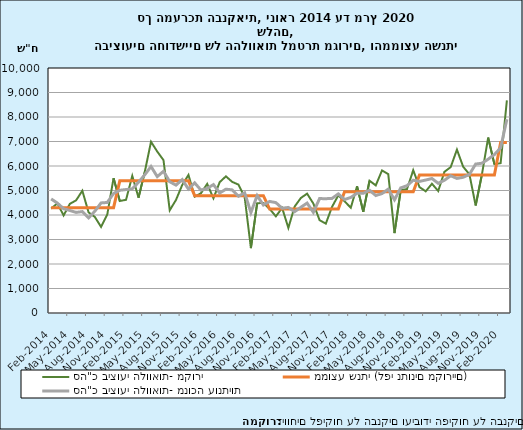
| Category | סה"כ ביצועי הלוואות- מקורי | ממוצע שנתי (לפי נתונים מקוריים) | סה"כ ביצועי הלוואות- מנוכה עונתיות |
|---|---|---|---|
| 2014-02-28 | 4262.255 | 4300.78 | 4656.6 |
| 2014-03-31 | 4474.033 | 4300.78 | 4486.302 |
| 2014-04-30 | 3982.901 | 4300.78 | 4256.606 |
| 2014-05-31 | 4455.752 | 4300.78 | 4184.699 |
| 2014-06-30 | 4597.51 | 4300.78 | 4105.33 |
| 2014-07-31 | 4990.735 | 4300.78 | 4140.172 |
| 2014-08-31 | 4107.263 | 4300.78 | 3880.733 |
| 2014-09-30 | 3921.35 | 4300.78 | 4154.599 |
| 2014-10-31 | 3514.015 | 4300.78 | 4493.338 |
| 2014-11-30 | 4028.095 | 4300.78 | 4511.738 |
| 2014-12-31 | 5503.691 | 4300.78 | 4878.427 |
| 2015-01-31 | 4571.678 | 5395.235 | 5009.474 |
| 2015-02-28 | 4620.799 | 5395.235 | 5038.755 |
| 2015-03-31 | 5598.333 | 5395.235 | 5068.132 |
| 2015-04-30 | 4706.018 | 5395.235 | 5336.437 |
| 2015-05-31 | 5758.492 | 5395.235 | 5642.826 |
| 2015-06-30 | 6989.609 | 5395.235 | 5979.787 |
| 2015-07-31 | 6589.807 | 5395.235 | 5567.734 |
| 2015-08-31 | 6239.136 | 5395.235 | 5784.56 |
| 2015-09-30 | 4193.816 | 5395.235 | 5357.218 |
| 2015-10-31 | 4614.968 | 5395.235 | 5219.326 |
| 2015-11-30 | 5225.496 | 5395.235 | 5444.914 |
| 2015-12-31 | 5634.671 | 5395.235 | 5056.326 |
| 2016-01-31 | 4749.288 | 4787.84 | 5310.136 |
| 2016-02-29 | 4887.666 | 4787.84 | 5015.614 |
| 2016-03-31 | 5270.148 | 4787.84 | 5085.74 |
| 2016-04-30 | 4682.424 | 4787.84 | 5241.66 |
| 2016-05-31 | 5341.393 | 4787.84 | 4898.916 |
| 2016-06-30 | 5578.193 | 4787.84 | 5053.7 |
| 2016-07-31 | 5352.595 | 4787.84 | 5025.18 |
| 2016-08-31 | 5241.707 | 4787.84 | 4765.946 |
| 2016-09-30 | 4731.688 | 4787.84 | 4905.809 |
| 2016-10-31 | 2647.758 | 4787.84 | 4099.974 |
| 2016-11-30 | 4481.202 | 4787.84 | 4791.876 |
| 2016-12-31 | 4490.01 | 4787.84 | 4408.024 |
| 2017-01-31 | 4248.31 | 4242.381 | 4553.314 |
| 2017-02-28 | 3944.469 | 4242.381 | 4505.337 |
| 2017-03-31 | 4289.487 | 4242.381 | 4275.485 |
| 2017-04-30 | 3473.905 | 4242.381 | 4309.382 |
| 2017-05-31 | 4342.823 | 4242.381 | 4133.867 |
| 2017-06-30 | 4694.724 | 4242.381 | 4314.875 |
| 2017-07-31 | 4871.464 | 4242.381 | 4487.427 |
| 2017-08-31 | 4468.632 | 4242.381 | 4109.391 |
| 2017-09-30 | 3788.691 | 4242.381 | 4670.494 |
| 2017-10-31 | 3648.135 | 4242.381 | 4665.296 |
| 2017-11-30 | 4335.356 | 4242.381 | 4677.791 |
| 2017-12-31 | 4802.58 | 4242.381 | 4861.406 |
| 2018-01-31 | 4559.431 | 4952.046 | 4632.492 |
| 2018-02-28 | 4295.92 | 4952.046 | 4715.88 |
| 2018-03-31 | 5172.816 | 4952.046 | 4890.041 |
| 2018-04-30 | 4132.657 | 4952.046 | 4885.777 |
| 2018-05-31 | 5400.146 | 4952.046 | 5012.274 |
| 2018-06-30 | 5210.652 | 4952.046 | 4795.296 |
| 2018-07-31 | 5820.56 | 4952.046 | 4874.554 |
| 2018-08-31 | 5667.401 | 4952.046 | 5055.894 |
| 2018-09-30 | 3261.965 | 4952.046 | 4620.998 |
| 2018-10-31 | 5018.568 | 4952.046 | 5106.44 |
| 2018-11-30 | 5055.774 | 4952.046 | 5196.24 |
| 2018-12-31 | 5828.665 | 4952.046 | 5419.932 |
| 2019-01-31 | 5139.212 | 5631.438 | 5371.243 |
| 2019-02-28 | 4966.333 | 5631.438 | 5426.443 |
| 2019-03-31 | 5276.03 | 5631.438 | 5489.254 |
| 2019-04-30 | 4979.657 | 5631.438 | 5292.838 |
| 2019-05-31 | 5764.735 | 5631.438 | 5418.417 |
| 2019-06-30 | 5953.594 | 5631.438 | 5601.801 |
| 2019-07-31 | 6668.414 | 5631.438 | 5493.03 |
| 2019-08-31 | 5969.81 | 5631.438 | 5539.965 |
| 2019-09-30 | 5659.203 | 5631.438 | 5656.259 |
| 2019-10-31 | 4389.713 | 5631.438 | 6079.34 |
| 2019-11-30 | 5650.701 | 5631.438 | 6113.317 |
| 2019-12-31 | 7159.851 | 5631.438 | 6276.644 |
| 2020-01-31 | 6075.829 | 5631.438 | 6467.157 |
| 2020-02-29 | 6113.739 | 6956.127 | 6742.974 |
| 2020-03-31 | 8678.812 | 6956.127 | 7909.015 |